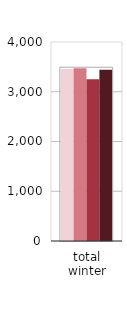
| Category | 2021−22 | 2022−23 | 2023−24 | 2024−25 |
|---|---|---|---|---|
| total winter | 3456.22 | 3472.008 | 3249.151 | 3440.473 |